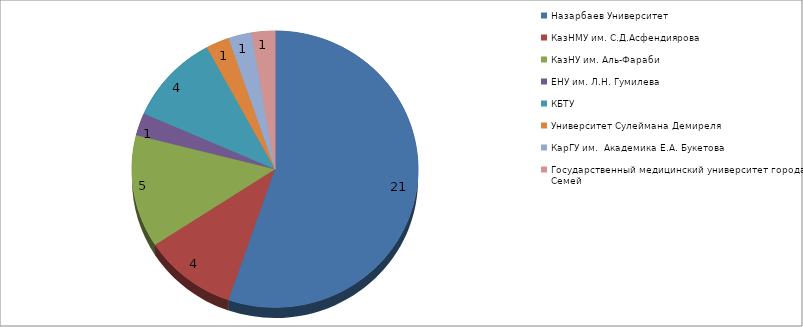
| Category | Series 0 |
|---|---|
| Назарбаев Университет | 21 |
| КазНМУ им. С.Д.Асфендиярова  | 4 |
| КазНУ им. Аль-Фараби | 5 |
| ЕНУ им. Л.Н. Гумилева | 1 |
| КБТУ | 4 |
| Университет Сулеймана Демиреля | 1 |
| КарГУ им.  Академика Е.А. Букетова | 1 |
| Государственный медицинский университет города Семей | 1 |